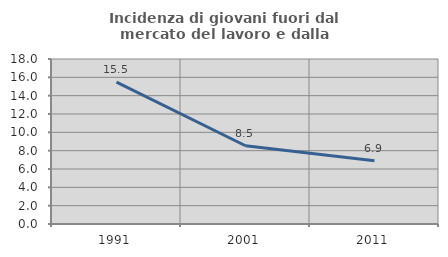
| Category | Incidenza di giovani fuori dal mercato del lavoro e dalla formazione  |
|---|---|
| 1991.0 | 15.47 |
| 2001.0 | 8.539 |
| 2011.0 | 6.89 |